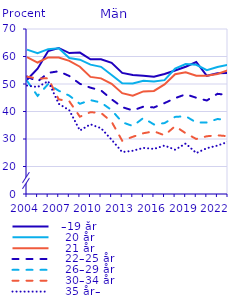
| Category |   –19 år |    20 år |    21 år |    22–25 år |    26–29 år |    30–34 år |    35 år– |
|---|---|---|---|---|---|---|---|
| 2004.0 | 51.565 | 62.514 | 59.756 | 52.738 | 51.136 | 52.656 | 49.42 |
| 2005.0 | 55.574 | 61.192 | 57.809 | 50.883 | 45.679 | 52.004 | 48.896 |
| 2006.0 | 61.978 | 62.672 | 59.675 | 54.04 | 49.979 | 52.08 | 51.039 |
| 2007.0 | 63.101 | 63.007 | 59.625 | 54.635 | 47.558 | 44.406 | 42.808 |
| 2008.0 | 61.259 | 59.429 | 58.402 | 52.905 | 45.759 | 43.708 | 40.443 |
| 2009.0 | 61.441 | 58.846 | 56.277 | 50.078 | 42.805 | 38.107 | 33.085 |
| 2010.0 | 58.991 | 57.04 | 52.59 | 48.666 | 44.141 | 39.755 | 35.336 |
| 2011.0 | 59.008 | 56.249 | 52.05 | 47.644 | 43.256 | 39.483 | 33.913 |
| 2012.0 | 57.674 | 53.294 | 50.046 | 44.45 | 40.506 | 36.253 | 29.718 |
| 2013.0 | 54.028 | 50.279 | 46.665 | 41.58 | 36.093 | 29.371 | 25.254 |
| 2014.0 | 53.267 | 50.21 | 45.722 | 40.392 | 34.723 | 30.802 | 25.717 |
| 2015.0 | 53.033 | 51.151 | 47.308 | 41.761 | 37.641 | 32.096 | 26.764 |
| 2016.0 | 52.612 | 50.949 | 47.491 | 41.475 | 35.283 | 32.786 | 26.386 |
| 2017.0 | 53.666 | 51.411 | 49.852 | 43.056 | 35.787 | 31.356 | 27.622 |
| 2018.0 | 54.927 | 55.633 | 53.571 | 44.846 | 38.034 | 34.653 | 26.108 |
| 2019.0 | 56.266 | 57.26 | 54.238 | 46.253 | 38.292 | 32.103 | 28.341 |
| 2020.0 | 58 | 57 | 53 | 45 | 36 | 30 | 24.891 |
| 2021.0 | 53 | 55 | 53 | 44 | 36 | 31 | 26.658 |
| 2022.0 | 53.934 | 56.204 | 53.666 | 46.426 | 37.255 | 31.359 | 27.591 |
| 2023.0 | 54 | 57 | 55 | 46 | 37 | 31 | 29 |